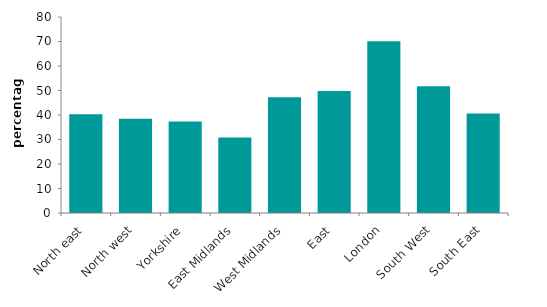
| Category | Series 0 |
|---|---|
| North east | 40.295 |
| North west | 38.464 |
| Yorkshire | 37.304 |
| East Midlands | 30.768 |
| West Midlands | 47.257 |
| East | 49.771 |
| London | 70.152 |
| South West | 51.754 |
| South East | 40.616 |